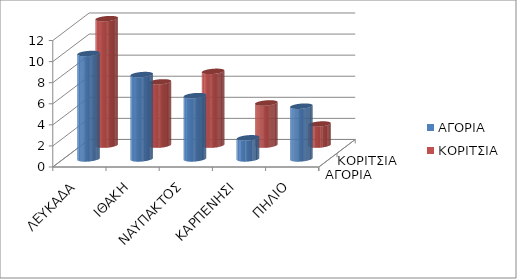
| Category | ΑΓΟΡΙΑ | ΚΟΡΙΤΣΙΑ |
|---|---|---|
| ΛΕΥΚΑΔΑ | 10 | 12 |
| ΙΘΑΚΗ  | 8 | 6 |
| ΝΑΥΠΑΚΤΟΣ | 6 | 7 |
| ΚΑΡΠΕΝΗΣΙ | 2 | 4 |
| ΠΗΛΙΟ | 5 | 2 |